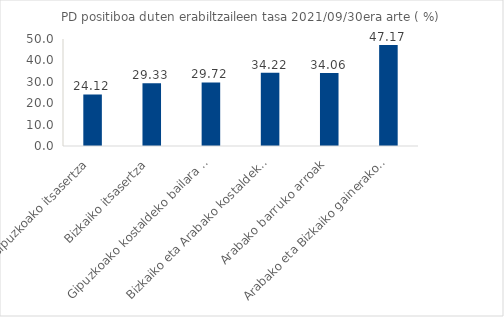
| Category | Series 0 |
|---|---|
| Gipuzkoako itsasertza | 24.123 |
| Bizkaiko itsasertza | 29.327 |
| Gipuzkoako kostaldeko bailara kantauriarrak | 29.723 |
| Bizkaiko eta Arabako kostaldeko bailara kantauriarrak | 34.224 |
| Arabako barruko arroak | 34.056 |
| Arabako eta Bizkaiko gainerakoak | 47.167 |